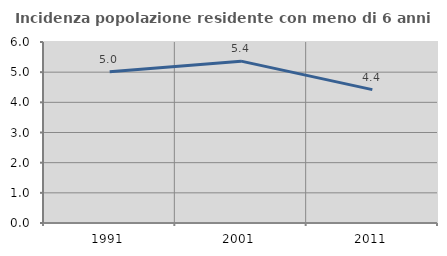
| Category | Incidenza popolazione residente con meno di 6 anni |
|---|---|
| 1991.0 | 5.018 |
| 2001.0 | 5.365 |
| 2011.0 | 4.421 |